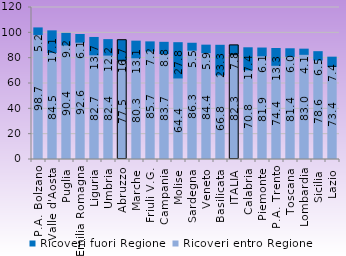
| Category | Ricoveri entro Regione | Ricoveri fuori Regione |
|---|---|---|
| P.A. Bolzano | 98.716 | 5.167 |
| Valle d'Aosta | 84.476 | 17.083 |
| Puglia | 90.416 | 9.153 |
| Emilia Romagna | 92.614 | 6.073 |
| Liguria | 82.675 | 13.68 |
| Umbria | 82.422 | 12.221 |
| Abruzzo | 77.526 | 16.653 |
| Marche | 80.312 | 13.115 |
| Friuli V.G. | 85.672 | 7.191 |
| Campania | 83.656 | 8.849 |
| Molise | 64.388 | 27.838 |
| Sardegna | 86.314 | 5.459 |
| Veneto | 84.424 | 5.854 |
| Basilicata | 66.827 | 23.343 |
| ITALIA | 82.34 | 7.753 |
| Calabria | 70.779 | 17.413 |
| Piemonte | 81.862 | 6.135 |
| P.A. Trento | 74.368 | 13.285 |
| Toscana | 81.45 | 5.959 |
| Lombardia | 83.032 | 4.082 |
| Sicilia | 78.609 | 6.521 |
| Lazio | 73.427 | 7.364 |